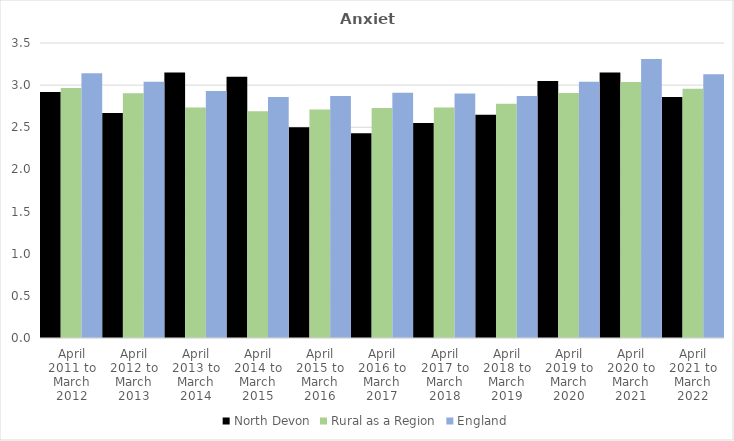
| Category | North Devon | Rural as a Region | England |
|---|---|---|---|
| April 2011 to March 2012 | 2.92 | 2.967 | 3.14 |
| April 2012 to March 2013 | 2.67 | 2.904 | 3.04 |
| April 2013 to March 2014 | 3.15 | 2.734 | 2.93 |
| April 2014 to March 2015 | 3.1 | 2.691 | 2.86 |
| April 2015 to March 2016 | 2.5 | 2.711 | 2.87 |
| April 2016 to March 2017 | 2.43 | 2.729 | 2.91 |
| April 2017 to March 2018 | 2.55 | 2.736 | 2.9 |
| April 2018 to March 2019 | 2.65 | 2.78 | 2.87 |
| April 2019 to March 2020 | 3.05 | 2.908 | 3.04 |
| April 2020 to March 2021 | 3.15 | 3.036 | 3.31 |
| April 2021 to March 2022 | 2.86 | 2.956 | 3.13 |